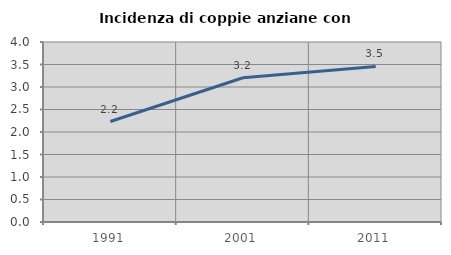
| Category | Incidenza di coppie anziane con figli |
|---|---|
| 1991.0 | 2.233 |
| 2001.0 | 3.205 |
| 2011.0 | 3.458 |